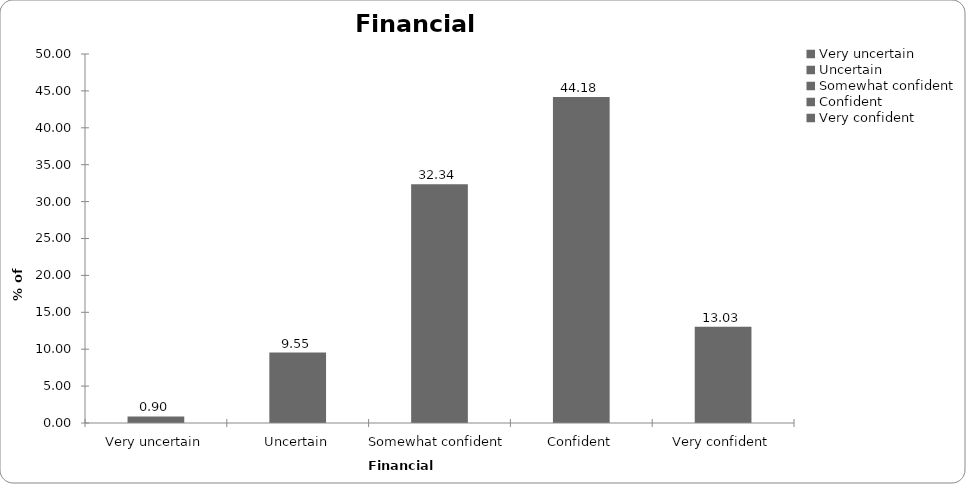
| Category | Financial confidence |
|---|---|
| Very uncertain | 0.896 |
| Uncertain | 9.552 |
| Somewhat confident | 32.338 |
| Confident | 44.179 |
| Very confident | 13.035 |